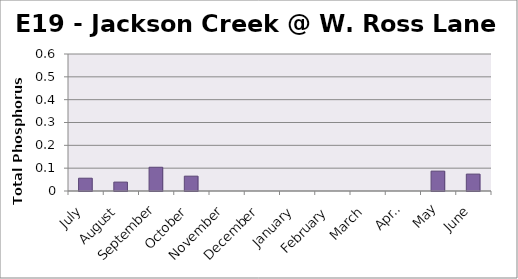
| Category | Phosphorus (mg/L) |
|---|---|
| July | 0.056 |
| August | 0.039 |
| September | 0.104 |
| October | 0.065 |
| November | 0 |
| December | 0 |
| January | 0 |
| February | 0 |
| March | 0 |
| April | 0 |
| May | 0.087 |
| June | 0.074 |